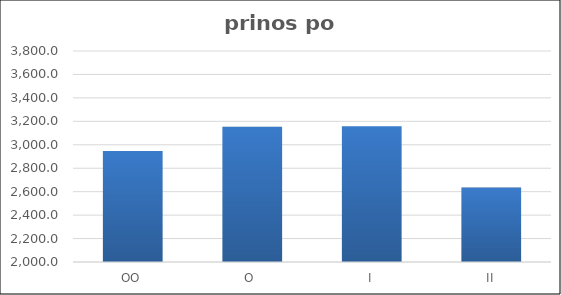
| Category | Series 0 |
|---|---|
| OO | 2947 |
| O  | 3153 |
| I | 3158 |
| II | 2635 |